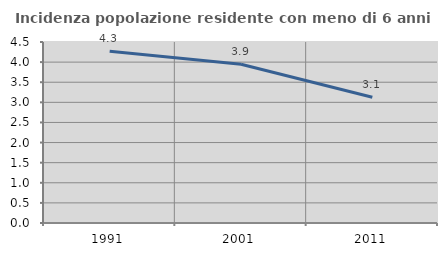
| Category | Incidenza popolazione residente con meno di 6 anni |
|---|---|
| 1991.0 | 4.268 |
| 2001.0 | 3.947 |
| 2011.0 | 3.125 |